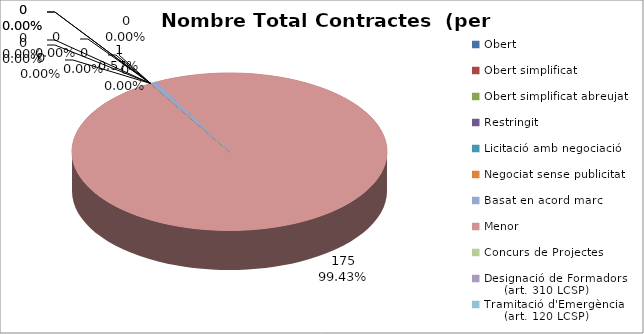
| Category | Nombre Total Contractes |
|---|---|
| Obert | 0 |
| Obert simplificat | 0 |
| Obert simplificat abreujat | 0 |
| Restringit | 0 |
| Licitació amb negociació | 0 |
| Negociat sense publicitat | 0 |
| Basat en acord marc | 1 |
| Menor | 175 |
| Concurs de Projectes | 0 |
| Designació de Formadors
     (art. 310 LCSP) | 0 |
| Tramitació d'Emergència
     (art. 120 LCSP) | 0 |